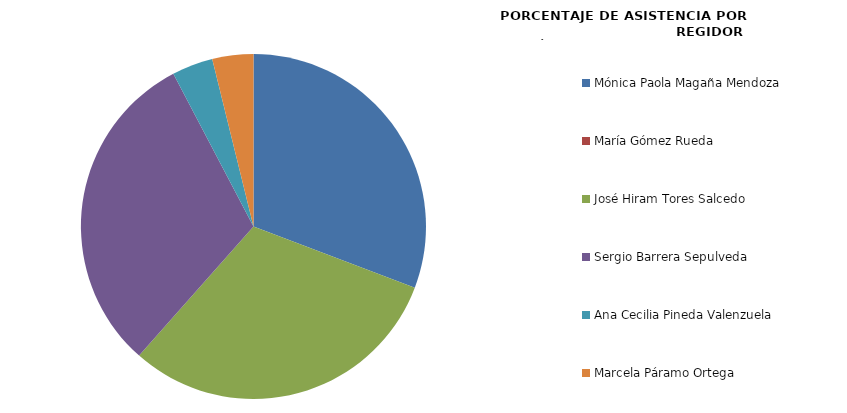
| Category | Series 0 |
|---|---|
| Mónica Paola Magaña Mendoza | 100 |
| María Gómez Rueda | 0 |
| José Hiram Tores Salcedo | 100 |
| Sergio Barrera Sepulveda | 100 |
| Ana Cecilia Pineda Valenzuela | 12.5 |
| Marcela Páramo Ortega | 12.5 |